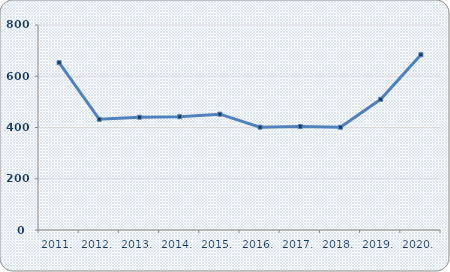
| Category | Broj zaposlenih |
|---|---|
| 2011. | 653 |
| 2012. | 432 |
| 2013. | 440 |
| 2014. | 442 |
| 2015. | 452 |
| 2016. | 401 |
| 2017. | 404 |
| 2018. | 401 |
| 2019. | 510 |
| 2020. | 684 |